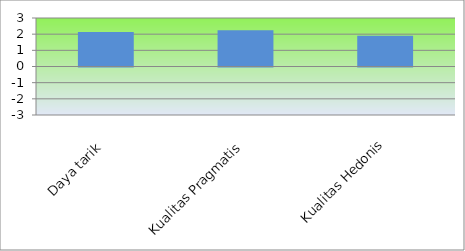
| Category | Series 0 |
|---|---|
| Daya tarik | 2.136 |
| Kualitas Pragmatis | 2.242 |
| Kualitas Hedonis | 1.909 |